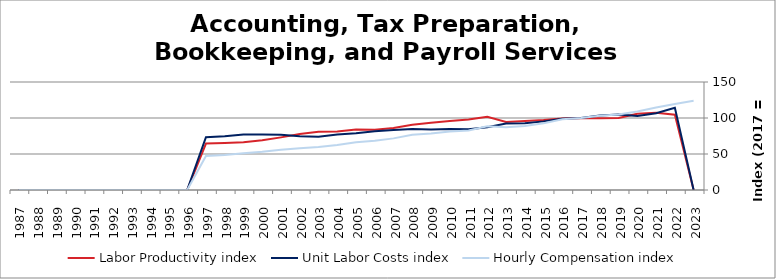
| Category | Labor Productivity index | Unit Labor Costs index | Hourly Compensation index |
|---|---|---|---|
| 2023.0 | 0 | 0 | 123.912 |
| 2022.0 | 104.582 | 114.284 | 119.52 |
| 2021.0 | 107.354 | 106.629 | 114.47 |
| 2020.0 | 106.021 | 102.867 | 109.061 |
| 2019.0 | 99.92 | 104.972 | 104.888 |
| 2018.0 | 99.609 | 103.595 | 103.19 |
| 2017.0 | 100 | 100 | 100 |
| 2016.0 | 99.182 | 98.953 | 98.143 |
| 2015.0 | 97.143 | 95.31 | 92.587 |
| 2014.0 | 95.896 | 92.776 | 88.968 |
| 2013.0 | 94.479 | 92.407 | 87.306 |
| 2012.0 | 101.806 | 87.104 | 88.677 |
| 2011.0 | 97.815 | 84.54 | 82.693 |
| 2010.0 | 95.854 | 84.754 | 81.24 |
| 2009.0 | 93.327 | 83.912 | 78.312 |
| 2008.0 | 90.613 | 84.83 | 76.867 |
| 2007.0 | 85.991 | 83.382 | 71.701 |
| 2006.0 | 83.793 | 81.699 | 68.458 |
| 2005.0 | 84.093 | 78.817 | 66.279 |
| 2004.0 | 81.329 | 76.919 | 62.557 |
| 2003.0 | 80.859 | 73.806 | 59.679 |
| 2002.0 | 77.65 | 74.667 | 57.979 |
| 2001.0 | 73.079 | 76.579 | 55.963 |
| 2000.0 | 69.008 | 76.944 | 53.097 |
| 1999.0 | 66.169 | 77.234 | 51.105 |
| 1998.0 | 65.221 | 74.588 | 48.648 |
| 1997.0 | 64.484 | 73.259 | 47.241 |
| 1996.0 | 0 | 0 | 0 |
| 1995.0 | 0 | 0 | 0 |
| 1994.0 | 0 | 0 | 0 |
| 1993.0 | 0 | 0 | 0 |
| 1992.0 | 0 | 0 | 0 |
| 1991.0 | 0 | 0 | 0 |
| 1990.0 | 0 | 0 | 0 |
| 1989.0 | 0 | 0 | 0 |
| 1988.0 | 0 | 0 | 0 |
| 1987.0 | 0 | 0 | 0 |